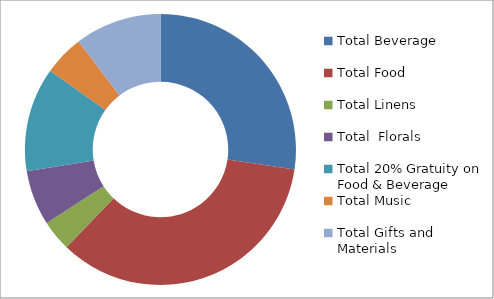
| Category | Series 0 |
|---|---|
| Total Beverage | 5600 |
| Total Food | 7127.5 |
| Total Linens | 755.5 |
| Total  Florals | 1339 |
| Total 20% Gratuity on Food & Beverage | 2545.5 |
| Total Music | 983.1 |
| Total Gifts and Materials | 2112.91 |